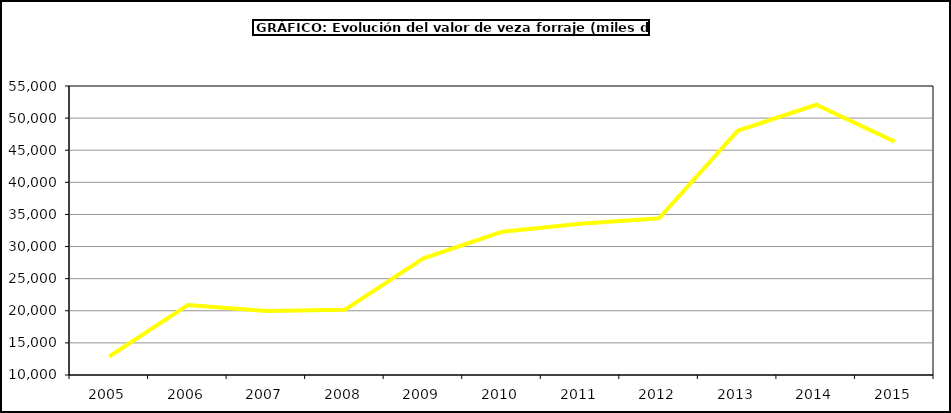
| Category | Valor |
|---|---|
| 2005.0 | 12883.645 |
| 2006.0 | 20881.991 |
| 2007.0 | 19961.228 |
| 2008.0 | 20170.083 |
| 2009.0 | 28162.401 |
| 2010.0 | 32296.558 |
| 2011.0 | 33540.553 |
| 2012.0 | 34393.555 |
| 2013.0 | 48025.512 |
| 2014.0 | 52077.137 |
| 2015.0 | 46338 |